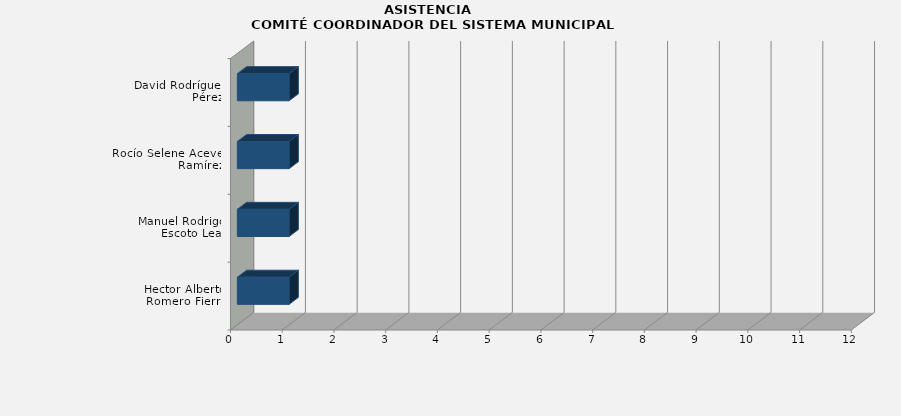
| Category | Series 0 |
|---|---|
| Hector Alberto Romero Fierro | 1 |
| Manuel Rodrigo Escoto Leal | 1 |
| Rocío Selene Aceves Ramírez | 1 |
| David Rodríguez Pérez | 1 |